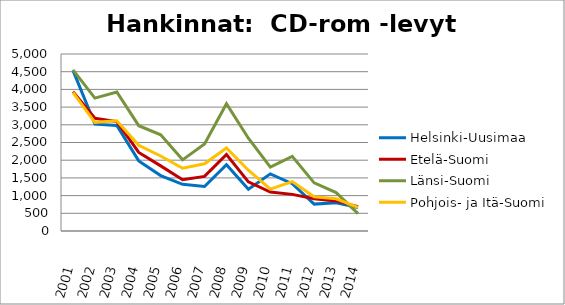
| Category | Helsinki-Uusimaa | Etelä-Suomi | Länsi-Suomi | Pohjois- ja Itä-Suomi |
|---|---|---|---|---|
| 2001.0 | 4537 | 3933 | 4552 | 3914 |
| 2002.0 | 3019 | 3183 | 3753 | 3069 |
| 2003.0 | 2981 | 3091 | 3928 | 3112 |
| 2004.0 | 1980 | 2220 | 2975 | 2421 |
| 2005.0 | 1566 | 1840 | 2717 | 2118 |
| 2006.0 | 1320 | 1449 | 2010 | 1774 |
| 2007.0 | 1258 | 1542 | 2458 | 1899 |
| 2008.0 | 1874 | 2161 | 3595 | 2347 |
| 2009.0 | 1178 | 1387 | 2622 | 1716 |
| 2010.0 | 1614 | 1100 | 1802 | 1182 |
| 2011.0 | 1336 | 1035 | 2110 | 1395 |
| 2012.0 | 760 | 912 | 1359 | 969 |
| 2013.0 | 799 | 850 | 1086 | 910 |
| 2014.0 | 660 | 689 | 490 | 669 |